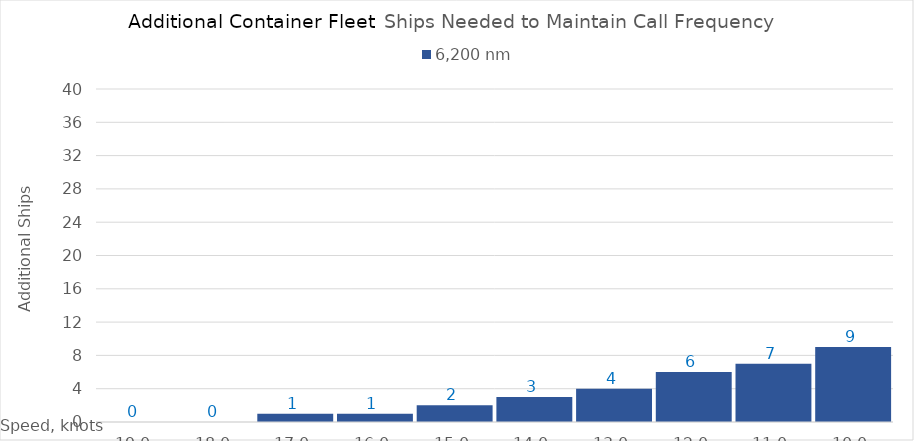
| Category | 6,200 |
|---|---|
| 19.0 | 0 |
| 18.0 | 0 |
| 17.0 | 1 |
| 16.0 | 1 |
| 15.0 | 2 |
| 14.0 | 3 |
| 13.0 | 4 |
| 12.0 | 6 |
| 11.0 | 7 |
| 10.0 | 9 |